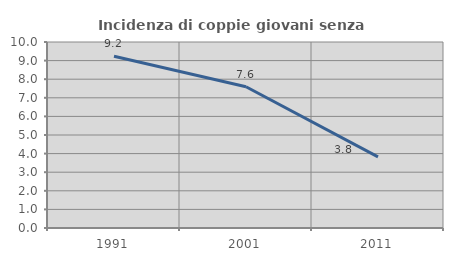
| Category | Incidenza di coppie giovani senza figli |
|---|---|
| 1991.0 | 9.229 |
| 2001.0 | 7.596 |
| 2011.0 | 3.822 |